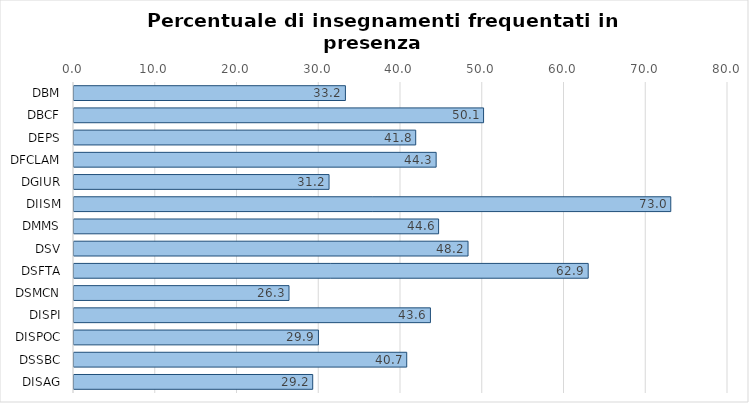
| Category | Series 0 |
|---|---|
| DBM | 33.2 |
| DBCF | 50.1 |
| DEPS | 41.8 |
| DFCLAM | 44.3 |
| DGIUR | 31.2 |
| DIISM | 73 |
| DMMS | 44.6 |
| DSV | 48.2 |
| DSFTA | 62.9 |
| DSMCN | 26.3 |
| DISPI | 43.6 |
| DISPOC | 29.9 |
| DSSBC | 40.7 |
| DISAG | 29.2 |